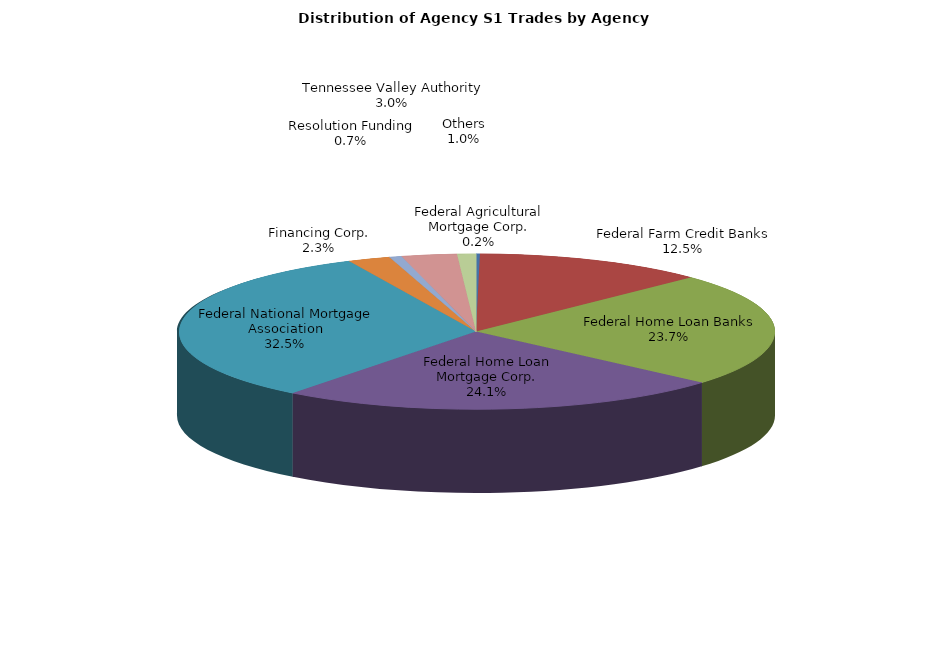
| Category | Series 0 |
|---|---|
| Federal Agricultural Mortgage Corp. | 8.187 |
| Federal Farm Credit Banks | 486.745 |
| Federal Home Loan Banks | 919.586 |
| Federal Home Loan Mortgage Corp. | 937.183 |
| Federal National Mortgage Association | 1265.215 |
| Financing Corp. | 88.976 |
| Resolution Funding | 26.084 |
| Tennessee Valley Authority | 116.239 |
| Others | 39.319 |